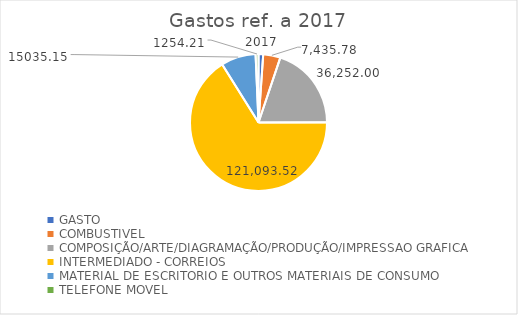
| Category | Series 0 |
|---|---|
| GASTO | 2017 |
| COMBUSTIVEL | 7435.78 |
| COMPOSIÇÃO/ARTE/DIAGRAMAÇÃO/PRODUÇÃO/IMPRESSAO GRAFICA | 36252 |
| INTERMEDIADO - CORREIOS | 121093.52 |
| MATERIAL DE ESCRITORIO E OUTROS MATERIAIS DE CONSUMO | 15035.15 |
| TELEFONE MOVEL | 1254.21 |